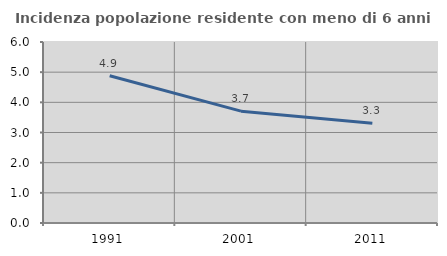
| Category | Incidenza popolazione residente con meno di 6 anni |
|---|---|
| 1991.0 | 4.88 |
| 2001.0 | 3.708 |
| 2011.0 | 3.307 |